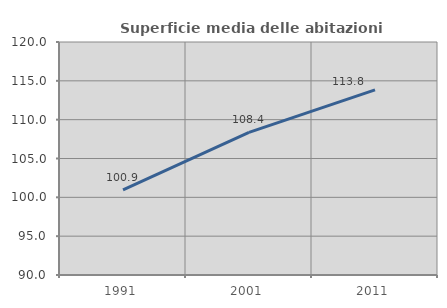
| Category | Superficie media delle abitazioni occupate |
|---|---|
| 1991.0 | 100.948 |
| 2001.0 | 108.355 |
| 2011.0 | 113.828 |